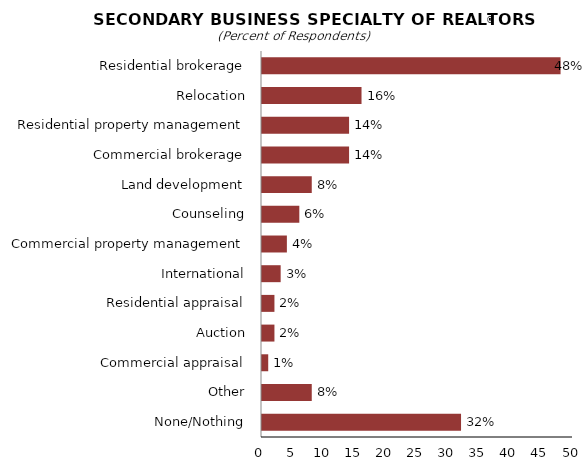
| Category | Series 0 |
|---|---|
| Residential brokerage | 48 |
| Relocation | 16 |
| Residential property management | 14 |
| Commercial brokerage | 14 |
| Land development | 8 |
| Counseling | 6 |
| Commercial property management | 4 |
| International | 3 |
| Residential appraisal | 2 |
| Auction | 2 |
| Commercial appraisal | 1 |
| Other | 8 |
| None/Nothing | 32 |